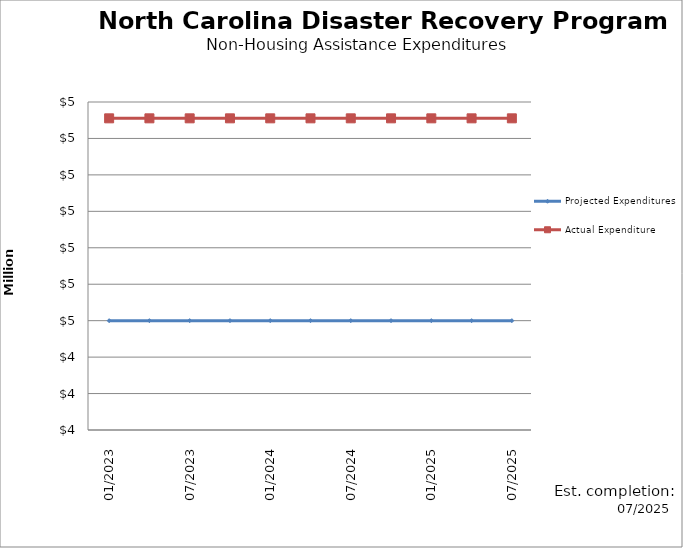
| Category | Projected Expenditures | Actual Expenditure |
|---|---|---|
| 01/2023 | 4500000 | 5055168.84 |
| 4/2023 | 4500000 | 5055168.84 |
| 07/2023 | 4500000 | 5055168.84 |
| 10/2023 | 4500000 | 5055168.84 |
| 01/2024 | 4500000 | 5055168.84 |
| 4/2024 | 4500000 | 5055168.84 |
| 07/2024 | 4500000 | 5055168.84 |
| 10/2024 | 4500000 | 5055168.84 |
| 01/2025 | 4500000 | 5055168.84 |
| 4/2025 | 4500000 | 5055168.84 |
| 07/2025 | 4500000 | 5055168.84 |